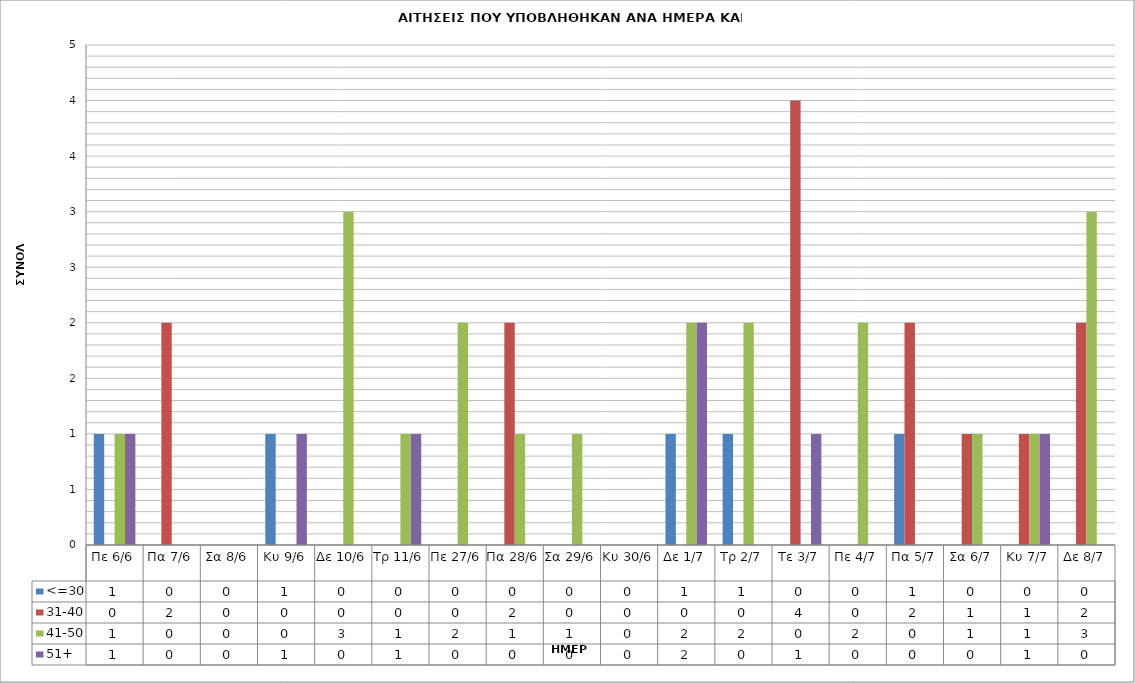
| Category | <=30 | 31-40 | 41-50 | 51+ |
|---|---|---|---|---|
| Πε 6/6 | 1 | 0 | 1 | 1 |
| Πα 7/6 | 0 | 2 | 0 | 0 |
| Σα 8/6 | 0 | 0 | 0 | 0 |
| Κυ 9/6 | 1 | 0 | 0 | 1 |
| Δε 10/6 | 0 | 0 | 3 | 0 |
| Τρ 11/6 | 0 | 0 | 1 | 1 |
| Πε 27/6 | 0 | 0 | 2 | 0 |
| Πα 28/6 | 0 | 2 | 1 | 0 |
| Σα 29/6 | 0 | 0 | 1 | 0 |
| Κυ 30/6 | 0 | 0 | 0 | 0 |
| Δε 1/7 | 1 | 0 | 2 | 2 |
| Τρ 2/7 | 1 | 0 | 2 | 0 |
| Τε 3/7 | 0 | 4 | 0 | 1 |
| Πε 4/7 | 0 | 0 | 2 | 0 |
| Πα 5/7 | 1 | 2 | 0 | 0 |
| Σα 6/7 | 0 | 1 | 1 | 0 |
| Κυ 7/7 | 0 | 1 | 1 | 1 |
| Δε 8/7 | 0 | 2 | 3 | 0 |